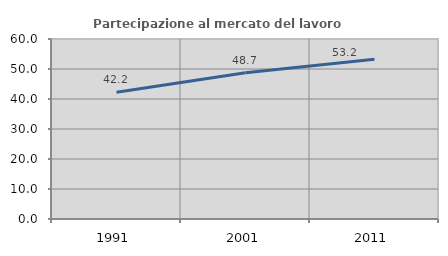
| Category | Partecipazione al mercato del lavoro  femminile |
|---|---|
| 1991.0 | 42.229 |
| 2001.0 | 48.734 |
| 2011.0 | 53.219 |